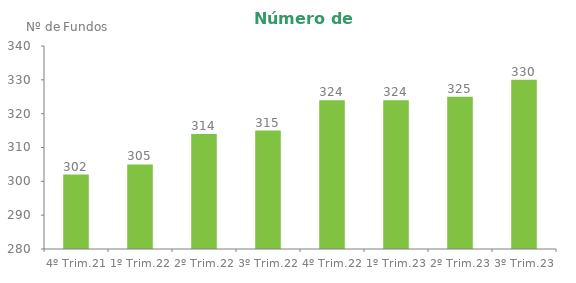
| Category | Series 0 |
|---|---|
| 4º Trim.21 | 302 |
| 1º Trim.22 | 305 |
| 2º Trim.22 | 314 |
| 3º Trim.22 | 315 |
| 4º Trim.22 | 324 |
| 1º Trim.23 | 324 |
| 2º Trim.23 | 325 |
| 3º Trim.23 | 330 |